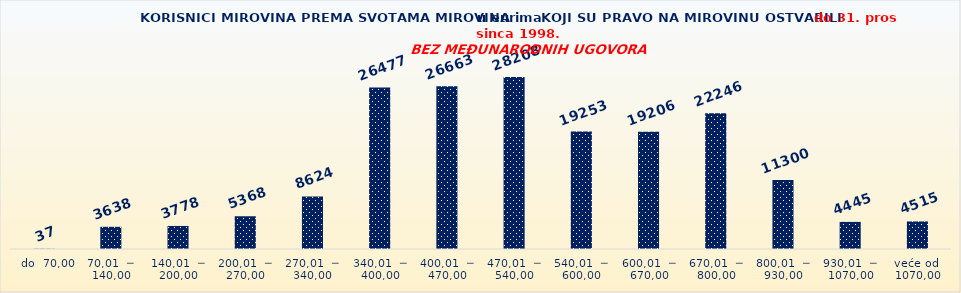
| Category | Series 0 |
|---|---|
|   do  70,00 | 37 |
| 70,01  ─  140,00 | 3638 |
| 140,01  ─  200,00 | 3778 |
| 200,01  ─  270,00 | 5368 |
| 270,01  ─  340,00 | 8624 |
| 340,01  ─  400,00 | 26477 |
| 400,01  ─  470,00 | 26663 |
| 470,01  ─  540,00 | 28208 |
| 540,01  ─  600,00 | 19253 |
| 600,01  ─  670,00 | 19206 |
| 670,01  ─  800,00 | 22246 |
| 800,01  ─  930,00 | 11300 |
| 930,01  ─  1070,00 | 4445 |
| veće od  1070,00 | 4515 |